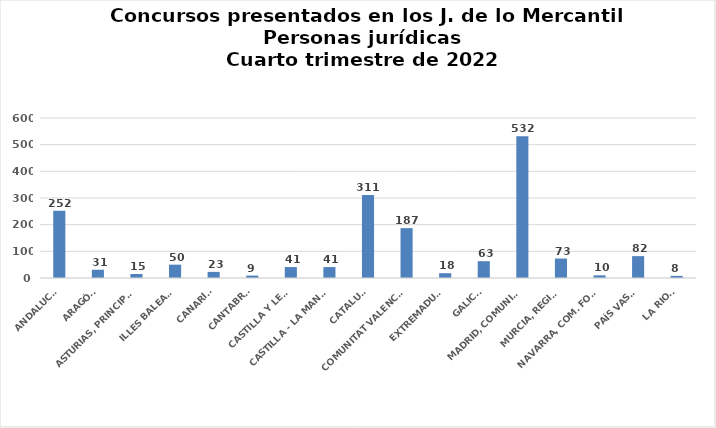
| Category | Series 0 |
|---|---|
| ANDALUCÍA | 252 |
| ARAGÓN | 31 |
| ASTURIAS, PRINCIPADO | 15 |
| ILLES BALEARS | 50 |
| CANARIAS | 23 |
| CANTABRIA | 9 |
| CASTILLA Y LEÓN | 41 |
| CASTILLA - LA MANCHA | 41 |
| CATALUÑA | 311 |
| COMUNITAT VALENCIANA | 187 |
| EXTREMADURA | 18 |
| GALICIA | 63 |
| MADRID, COMUNIDAD | 532 |
| MURCIA, REGIÓN | 73 |
| NAVARRA, COM. FORAL | 10 |
| PAÍS VASCO | 82 |
| LA RIOJA | 8 |